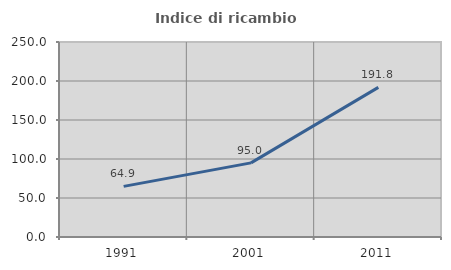
| Category | Indice di ricambio occupazionale  |
|---|---|
| 1991.0 | 64.884 |
| 2001.0 | 95.044 |
| 2011.0 | 191.829 |